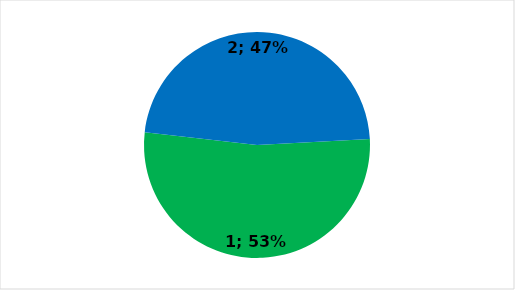
| Category | Series 0 |
|---|---|
| 0 | 239 |
| 1 | 215 |